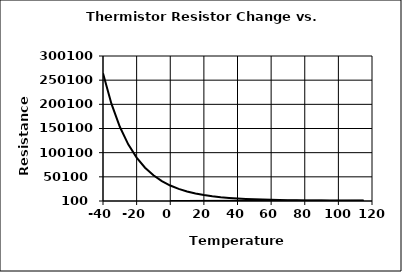
| Category | Therm |
|---|---|
| -40.0 | 264279 |
| -35.0 | 201487 |
| -30.0 | 153610 |
| -25.0 | 117280 |
| -20.0 | 89776 |
| -15.0 | 68963 |
| -10.0 | 53198 |
| -5.0 | 41229 |
| 0.0 | 32116 |
| 5.0 | 25150 |
| 10.0 | 19783 |
| 15.0 | 15681 |
| 20.0 | 12487 |
| 25.0 | 10000 |
| 30.0 | 8052 |
| 35.0 | 6520 |
| 40.0 | 5309 |
| 45.0 | 4345 |
| 50.0 | 3588 |
| 55.0 | 2956 |
| 60.0 | 2457 |
| 65.0 | 2051 |
| 70.0 | 1721 |
| 75.0 | 1450 |
| 80.0 | 1228 |
| 85.0 | 1044 |
| 90.0 | 891 |
| 95.0 | 763 |
| 100.0 | 657 |
| 105.0 | 567 |
| 110.0 | 491 |
| 115.0 | 427 |
| 0.0 | 0 |
| 0.0 | 0 |
| 0.0 | 0 |
| 0.0 | 0 |